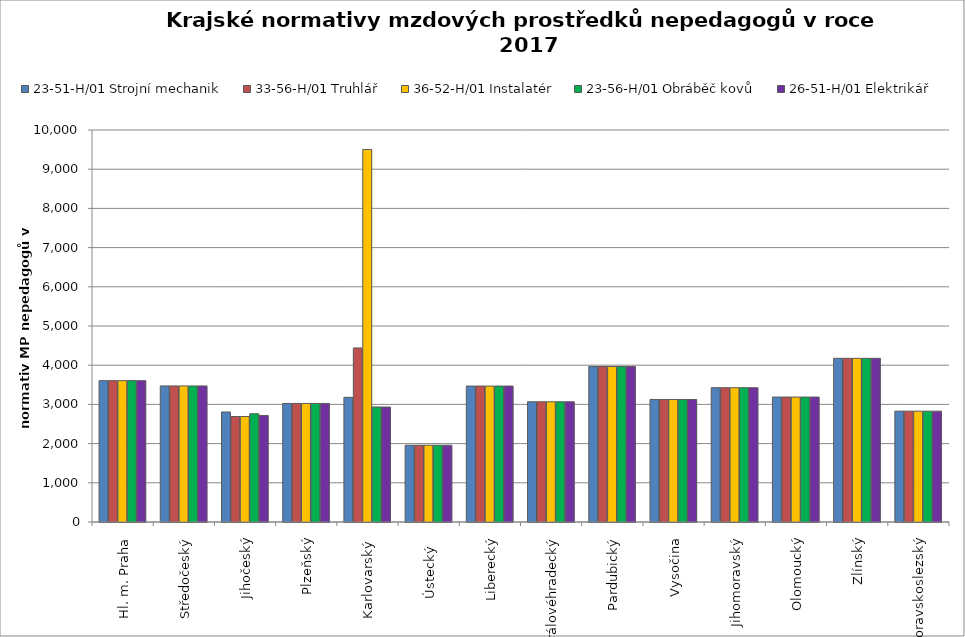
| Category | 23-51-H/01 Strojní mechanik | 33-56-H/01 Truhlář | 36-52-H/01 Instalatér | 23-56-H/01 Obráběč kovů | 26-51-H/01 Elektrikář |
|---|---|---|---|---|---|
| Hl. m. Praha | 3605.806 | 3605.806 | 3605.806 | 3605.806 | 3605.806 |
| Středočeský | 3471.309 | 3471.309 | 3471.309 | 3471.309 | 3471.309 |
| Jihočeský | 2806.361 | 2690.773 | 2690.773 | 2760.813 | 2717.948 |
| Plzeňský | 3024.545 | 3024.545 | 3024.545 | 3024.545 | 3024.545 |
| Karlovarský  | 3179.937 | 4440.145 | 9503.106 | 2934.736 | 2932.907 |
| Ústecký   | 1958.474 | 1958.474 | 1958.474 | 1958.474 | 1958.474 |
| Liberecký | 3467.889 | 3467.889 | 3467.889 | 3467.889 | 3467.889 |
| Královéhradecký | 3066.898 | 3066.898 | 3066.898 | 3066.898 | 3066.898 |
| Pardubický | 3965.455 | 3965.455 | 3965.455 | 3965.455 | 3965.455 |
| Vysočina | 3125.692 | 3125.692 | 3125.692 | 3125.692 | 3125.692 |
| Jihomoravský | 3426.326 | 3426.326 | 3426.326 | 3426.326 | 3426.326 |
| Olomoucký | 3187.482 | 3187.482 | 3187.482 | 3187.482 | 3187.482 |
| Zlínský | 4175.51 | 4175.51 | 4175.51 | 4175.51 | 4175.51 |
| Moravskoslezský | 2828.209 | 2828.209 | 2828.209 | 2828.209 | 2828.209 |